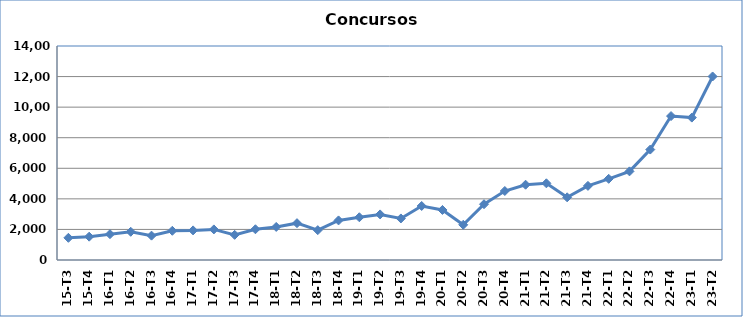
| Category | Series 0 |
|---|---|
| 15-T3 | 1451 |
| 15-T4 | 1526 |
| 16-T1 | 1689 |
| 16-T2 | 1847 |
| 16-T3 | 1593 |
| 16-T4 | 1911 |
| 17-T1 | 1937 |
| 17-T2 | 2001 |
| 17-T3 | 1645 |
| 17-T4 | 2011 |
| 18-T1 | 2162 |
| 18-T2 | 2410 |
| 18-T3 | 1953 |
| 18-T4 | 2590 |
| 19-T1 | 2796 |
| 19-T2 | 2982 |
| 19-T3 | 2719 |
| 19-T4 | 3534 |
| 20-T1 | 3274 |
| 20-T2 | 2305 |
| 20-T3 | 3649 |
| 20-T4 | 4513 |
| 21-T1 | 4925 |
| 21-T2 | 5017 |
| 21-T3 | 4101 |
| 21-T4 | 4849 |
| 22-T1 | 5312 |
| 22-T2 | 5798 |
| 22-T3 | 7225 |
| 22-T4 | 9416 |
| 23-T1 | 9316 |
| 23-T2 | 12006 |